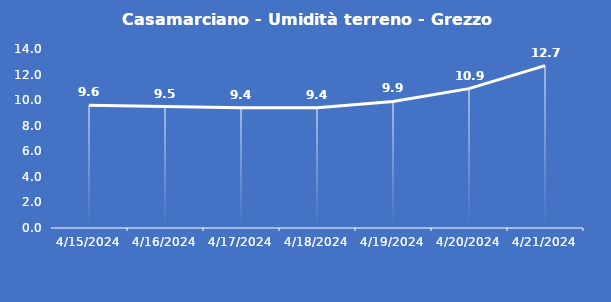
| Category | Casamarciano - Umidità terreno - Grezzo (%VWC) |
|---|---|
| 4/15/24 | 9.6 |
| 4/16/24 | 9.5 |
| 4/17/24 | 9.4 |
| 4/18/24 | 9.4 |
| 4/19/24 | 9.9 |
| 4/20/24 | 10.9 |
| 4/21/24 | 12.7 |